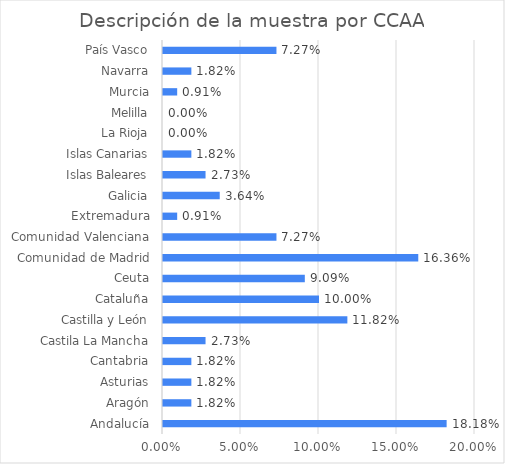
| Category | Series 0 |
|---|---|
| Andalucía | 0.182 |
| Aragón | 0.018 |
| Asturias | 0.018 |
| Cantabria | 0.018 |
| Castila La Mancha | 0.027 |
| Castilla y León | 0.118 |
| Cataluña | 0.1 |
| Ceuta | 0.091 |
| Comunidad de Madrid | 0.164 |
| Comunidad Valenciana | 0.073 |
| Extremadura | 0.009 |
| Galicia | 0.036 |
| Islas Baleares | 0.027 |
| Islas Canarias | 0.018 |
| La Rioja | 0 |
| Melilla | 0 |
| Murcia | 0.009 |
| Navarra | 0.018 |
| País Vasco | 0.073 |